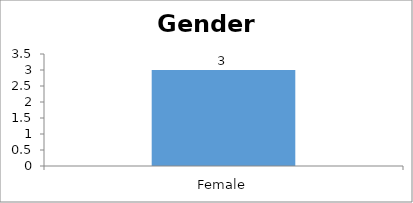
| Category | Gender |
|---|---|
| Female | 3 |